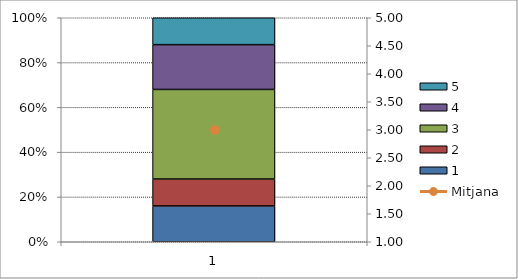
| Category | 1 | 2 | 3 | 4 | 5 |
|---|---|---|---|---|---|
| 0 | 4 | 3 | 10 | 5 | 3 |